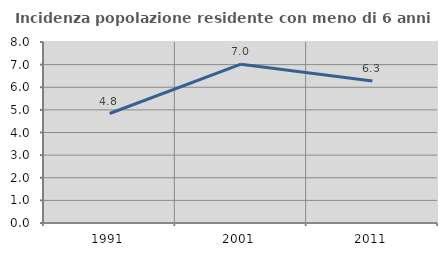
| Category | Incidenza popolazione residente con meno di 6 anni |
|---|---|
| 1991.0 | 4.839 |
| 2001.0 | 7.02 |
| 2011.0 | 6.275 |